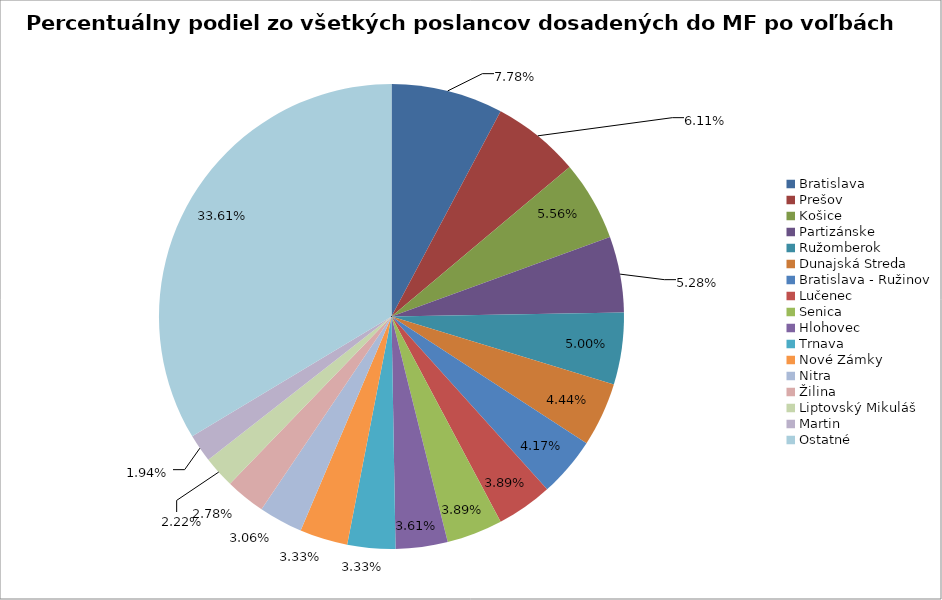
| Category | Percentuálny podiel zo všetkých poslancov dosadených do MF po voľbách 2014 |
|---|---|
| Bratislava | 0.078 |
| Prešov | 0.061 |
| Košice | 0.056 |
| Partizánske | 0.053 |
| Ružomberok | 0.05 |
| Dunajská Streda | 0.044 |
| Bratislava - Ružinov | 0.042 |
| Lučenec | 0.039 |
| Senica | 0.039 |
| Hlohovec | 0.036 |
| Trnava | 0.033 |
| Nové Zámky | 0.033 |
| Nitra | 0.031 |
| Žilina | 0.028 |
| Liptovský Mikuláš | 0.022 |
| Martin | 0.019 |
| Ostatné | 0.336 |